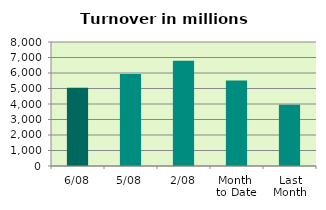
| Category | Series 0 |
|---|---|
| 6/08 | 5047.076 |
| 5/08 | 5938.473 |
| 2/08 | 6796.454 |
| Month 
to Date | 5523.515 |
| Last
Month | 3946.236 |